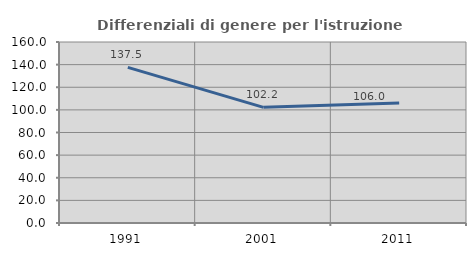
| Category | Differenziali di genere per l'istruzione superiore |
|---|---|
| 1991.0 | 137.55 |
| 2001.0 | 102.241 |
| 2011.0 | 106.038 |